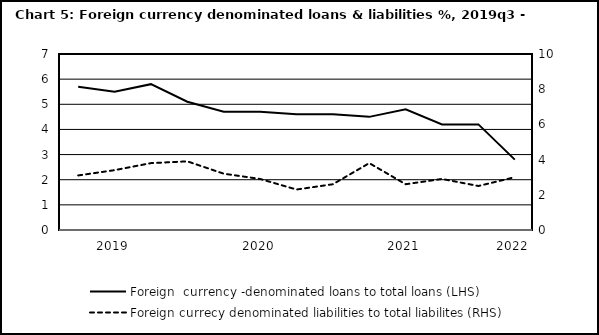
| Category | Foreign  currency -denominated loans to total loans (LHS) |
|---|---|
| nan | 5.7 |
| 2019.0 | 5.5 |
| nan | 5.8 |
| nan | 5.1 |
| nan | 4.7 |
| 2020.0 | 4.7 |
| nan | 4.6 |
| nan | 4.6 |
| nan | 4.5 |
| 2021.0 | 4.8 |
| nan | 4.2 |
| nan | 4.2 |
| 2022.0 | 2.8 |